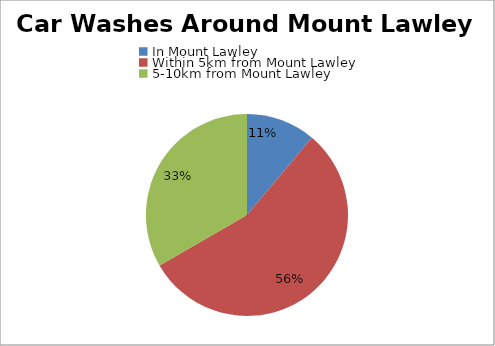
| Category | Series 0 |
|---|---|
| In Mount Lawley | 1 |
| Within 5km from Mount Lawley | 5 |
| 5-10km from Mount Lawley | 3 |